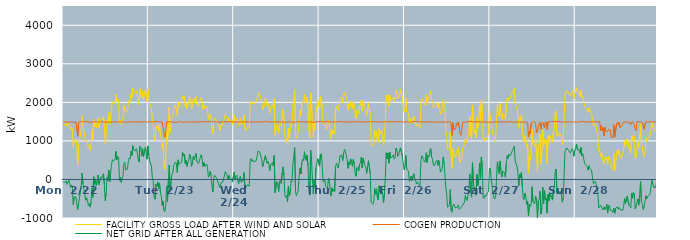
| Category | FACILITY GROSS LOAD AFTER WIND AND SOLAR | COGEN PRODUCTION | NET GRID AFTER ALL GENERATION |
|---|---|---|---|
|  Mon  2/22 | 1425 | 1504 | -79 |
|  Mon  2/22 | 1432 | 1490 | -58 |
|  Mon  2/22 | 1416 | 1486 | -70 |
|  Mon  2/22 | 1455 | 1494 | -39 |
|  Mon  2/22 | 1371 | 1497 | -126 |
|  Mon  2/22 | 1423 | 1491 | -68 |
|  Mon  2/22 | 1472 | 1481 | -9 |
|  Mon  2/22 | 1395 | 1493 | -98 |
|  Mon  2/22 | 1285 | 1495 | -210 |
|  Mon  2/22 | 1351 | 1493 | -142 |
|  Mon  2/22 | 1308 | 1497 | -189 |
|  Mon  2/22 | 839 | 1493 | -654 |
|  Mon  2/22 | 1015 | 1475 | -460 |
|  Mon  2/22 | 1027 | 1500 | -473 |
|  Mon  2/22 | 1042 | 1495 | -453 |
|  Mon  2/22 | 847 | 1485 | -638 |
|  Mon  2/22 | 346 | 1122 | -776 |
|  Mon  2/22 | 831 | 1474 | -643 |
|  Mon  2/22 | 1028 | 1493 | -465 |
|  Mon  2/22 | 1154 | 1503 | -349 |
|  Mon  2/22 | 1323 | 1505 | -182 |
|  Mon  2/22 | 1661 | 1495 | 166 |
|  Mon  2/22 | 1390 | 1502 | -112 |
|  Mon  2/22 | 1245 | 1497 | -252 |
|  Mon  2/22 | 1099 | 1480 | -381 |
|  Mon  2/22 | 953 | 1494 | -541 |
|  Mon  2/22 | 1009 | 1487 | -478 |
|  Mon  2/22 | 965 | 1502 | -537 |
|  Mon  2/22 | 834 | 1507 | -673 |
|  Mon  2/22 | 866 | 1492 | -626 |
|  Mon  2/22 | 742 | 1460 | -718 |
|  Mon  2/22 | 898 | 1493 | -595 |
|  Mon  2/22 | 1268 | 1491 | -223 |
|  Mon  2/22 | 1029 | 1493 | -464 |
|  Mon  2/22 | 1568 | 1497 | 71 |
|  Mon  2/22 | 1360 | 1495 | -135 |
|  Mon  2/22 | 1515 | 1501 | 14 |
|  Mon  2/22 | 1344 | 1502 | -158 |
|  Mon  2/22 | 1446 | 1501 | -55 |
|  Mon  2/22 | 1597 | 1482 | 115 |
|  Mon  2/22 | 1349 | 1483 | -134 |
|  Mon  2/22 | 1457 | 1497 | -40 |
|  Mon  2/22 | 1559 | 1490 | 69 |
|  Mon  2/22 | 1535 | 1506 | 29 |
|  Mon  2/22 | 1553 | 1500 | 53 |
|  Mon  2/22 | 1634 | 1487 | 147 |
|  Mon  2/22 | 1366 | 1494 | -128 |
|  Mon  2/22 | 931 | 1487 | -556 |
|  Mon  2/22 | 1148 | 1496 | -348 |
|  Mon  2/22 | 1531 | 1483 | 48 |
|  Mon  2/22 | 1461 | 1490 | -29 |
|  Mon  2/22 | 1730 | 1487 | 243 |
|  Mon  2/22 | 1424 | 1489 | -65 |
|  Mon  2/22 | 1641 | 1489 | 152 |
|  Mon  2/22 | 1857 | 1495 | 362 |
|  Mon  2/22 | 2005 | 1491 | 514 |
|  Mon  2/22 | 1972 | 1495 | 477 |
|  Mon  2/22 | 1964 | 1495 | 469 |
|  Mon  2/22 | 2003 | 1487 | 516 |
|  Mon  2/22 | 2212 | 1484 | 728 |
|  Mon  2/22 | 2017 | 1502 | 515 |
|  Mon  2/22 | 2092 | 1496 | 596 |
|  Mon  2/22 | 2055 | 1507 | 548 |
|  Mon  2/22 | 1480 | 1501 | -21 |
|  Mon  2/22 | 1539 | 1487 | 52 |
|  Mon  2/22 | 1419 | 1491 | -72 |
|  Mon  2/22 | 1528 | 1500 | 28 |
|  Mon  2/22 | 1597 | 1490 | 107 |
|  Mon  2/22 | 1923 | 1506 | 417 |
|  Mon  2/22 | 1934 | 1491 | 443 |
|  Mon  2/22 | 1736 | 1491 | 245 |
|  Mon  2/22 | 1759 | 1490 | 269 |
|  Mon  2/22 | 1772 | 1501 | 271 |
|  Mon  2/22 | 1963 | 1491 | 472 |
|  Mon  2/22 | 2054 | 1494 | 560 |
|  Mon  2/22 | 2024 | 1493 | 531 |
|  Mon  2/22 | 2221 | 1487 | 734 |
|  Mon  2/22 | 2120 | 1496 | 624 |
|  Mon  2/22 | 2366 | 1494 | 872 |
|  Mon  2/22 | 2260 | 1497 | 763 |
|  Mon  2/22 | 2269 | 1487 | 782 |
|  Mon  2/22 | 2230 | 1484 | 746 |
|  Mon  2/22 | 2305 | 1501 | 804 |
|  Mon  2/22 | 2205 | 1495 | 710 |
|  Mon  2/22 | 2030 | 1492 | 538 |
|  Mon  2/22 | 1938 | 1487 | 451 |
|  Mon  2/22 | 2352 | 1487 | 865 |
|  Mon  2/22 | 2330 | 1498 | 832 |
|  Mon  2/22 | 2109 | 1500 | 609 |
|  Mon  2/22 | 2291 | 1492 | 799 |
|  Mon  2/22 | 2080 | 1489 | 591 |
|  Mon  2/22 | 2207 | 1499 | 708 |
|  Mon  2/22 | 2321 | 1487 | 834 |
|  Mon  2/22 | 2219 | 1493 | 726 |
|  Mon  2/22 | 2004 | 1478 | 526 |
|  Mon  2/22 | 2356 | 1488 | 868 |
|  Tue  2/23 | 2133 | 1497 | 636 |
|  Tue  2/23 | 1982 | 1503 | 479 |
|  Tue  2/23 | 1987 | 1502 | 485 |
|  Tue  2/23 | 1826 | 1488 | 338 |
|  Tue  2/23 | 1543 | 1501 | 42 |
|  Tue  2/23 | 1434 | 1492 | -58 |
|  Tue  2/23 | 1033 | 1487 | -454 |
|  Tue  2/23 | 985 | 1500 | -515 |
|  Tue  2/23 | 1376 | 1495 | -119 |
|  Tue  2/23 | 1312 | 1496 | -184 |
|  Tue  2/23 | 1434 | 1495 | -61 |
|  Tue  2/23 | 1270 | 1503 | -233 |
|  Tue  2/23 | 1399 | 1490 | -91 |
|  Tue  2/23 | 1166 | 1491 | -325 |
|  Tue  2/23 | 1063 | 1494 | -431 |
|  Tue  2/23 | 817 | 1491 | -674 |
|  Tue  2/23 | 943 | 1504 | -561 |
|  Tue  2/23 | 422 | 1217 | -795 |
|  Tue  2/23 | 256 | 1093 | -837 |
|  Tue  2/23 | 538 | 1239 | -701 |
|  Tue  2/23 | 1311 | 1496 | -185 |
|  Tue  2/23 | 919 | 1493 | -574 |
|  Tue  2/23 | 1468 | 1496 | -28 |
|  Tue  2/23 | 1874 | 1501 | 373 |
|  Tue  2/23 | 1221 | 1501 | -280 |
|  Tue  2/23 | 1407 | 1492 | -85 |
|  Tue  2/23 | 1617 | 1488 | 129 |
|  Tue  2/23 | 1668 | 1489 | 179 |
|  Tue  2/23 | 1844 | 1487 | 357 |
|  Tue  2/23 | 1843 | 1484 | 359 |
|  Tue  2/23 | 1931 | 1481 | 450 |
|  Tue  2/23 | 1910 | 1493 | 417 |
|  Tue  2/23 | 1668 | 1489 | 179 |
|  Tue  2/23 | 2002 | 1494 | 508 |
|  Tue  2/23 | 1882 | 1488 | 394 |
|  Tue  2/23 | 1902 | 1480 | 422 |
|  Tue  2/23 | 1949 | 1505 | 444 |
|  Tue  2/23 | 1952 | 1499 | 453 |
|  Tue  2/23 | 2175 | 1476 | 699 |
|  Tue  2/23 | 2101 | 1493 | 608 |
|  Tue  2/23 | 2156 | 1496 | 660 |
|  Tue  2/23 | 1894 | 1482 | 412 |
|  Tue  2/23 | 1982 | 1488 | 494 |
|  Tue  2/23 | 1836 | 1494 | 342 |
|  Tue  2/23 | 1943 | 1484 | 459 |
|  Tue  2/23 | 1982 | 1488 | 494 |
|  Tue  2/23 | 2142 | 1495 | 647 |
|  Tue  2/23 | 2091 | 1505 | 586 |
|  Tue  2/23 | 1828 | 1486 | 342 |
|  Tue  2/23 | 1917 | 1488 | 429 |
|  Tue  2/23 | 2092 | 1495 | 597 |
|  Tue  2/23 | 1994 | 1481 | 513 |
|  Tue  2/23 | 1987 | 1489 | 498 |
|  Tue  2/23 | 2155 | 1485 | 670 |
|  Tue  2/23 | 1953 | 1490 | 463 |
|  Tue  2/23 | 1978 | 1499 | 479 |
|  Tue  2/23 | 1901 | 1490 | 411 |
|  Tue  2/23 | 1970 | 1485 | 485 |
|  Tue  2/23 | 2085 | 1503 | 582 |
|  Tue  2/23 | 2135 | 1493 | 642 |
|  Tue  2/23 | 2025 | 1499 | 526 |
|  Tue  2/23 | 1813 | 1474 | 339 |
|  Tue  2/23 | 1920 | 1484 | 436 |
|  Tue  2/23 | 1841 | 1498 | 343 |
|  Tue  2/23 | 1826 | 1501 | 325 |
|  Tue  2/23 | 1902 | 1504 | 398 |
|  Tue  2/23 | 1814 | 1495 | 319 |
|  Tue  2/23 | 1553 | 1495 | 58 |
|  Tue  2/23 | 1596 | 1503 | 93 |
|  Tue  2/23 | 1691 | 1485 | 206 |
|  Tue  2/23 | 1605 | 1496 | 109 |
|  Tue  2/23 | 1321 | 1494 | -173 |
|  Tue  2/23 | 1182 | 1504 | -322 |
|  Tue  2/23 | 1519 | 1495 | 24 |
|  Tue  2/23 | 1593 | 1486 | 107 |
|  Tue  2/23 | 1615 | 1497 | 118 |
|  Tue  2/23 | 1547 | 1500 | 47 |
|  Tue  2/23 | 1483 | 1490 | -7 |
|  Tue  2/23 | 1388 | 1482 | -94 |
|  Tue  2/23 | 1415 | 1500 | -85 |
|  Tue  2/23 | 1274 | 1488 | -214 |
|  Tue  2/23 | 1409 | 1496 | -87 |
|  Tue  2/23 | 1394 | 1497 | -103 |
|  Tue  2/23 | 1410 | 1485 | -75 |
|  Tue  2/23 | 1416 | 1496 | -80 |
|  Tue  2/23 | 1582 | 1494 | 88 |
|  Tue  2/23 | 1695 | 1491 | 204 |
|  Tue  2/23 | 1640 | 1482 | 158 |
|  Tue  2/23 | 1600 | 1497 | 103 |
|  Tue  2/23 | 1516 | 1503 | 13 |
|  Tue  2/23 | 1598 | 1497 | 101 |
|  Tue  2/23 | 1500 | 1491 | 9 |
|  Tue  2/23 | 1531 | 1503 | 28 |
|  Tue  2/23 | 1504 | 1495 | 9 |
|  Tue  2/23 | 1431 | 1497 | -66 |
|  Tue  2/23 | 1432 | 1492 | -60 |
|  Wed  2/24 | 1678 | 1491 | 187 |
|  Wed  2/24 | 1484 | 1492 | -8 |
|  Wed  2/24 | 1563 | 1490 | 73 |
|  Wed  2/24 | 1600 | 1485 | 115 |
|  Wed  2/24 | 1461 | 1486 | -25 |
|  Wed  2/24 | 1399 | 1505 | -106 |
|  Wed  2/24 | 1526 | 1492 | 34 |
|  Wed  2/24 | 1581 | 1494 | 87 |
|  Wed  2/24 | 1419 | 1492 | -73 |
|  Wed  2/24 | 1500 | 1501 | -1 |
|  Wed  2/24 | 1452 | 1494 | -42 |
|  Wed  2/24 | 1669 | 1490 | 179 |
|  Wed  2/24 | 1344 | 1489 | -145 |
|  Wed  2/24 | 1267 | 1491 | -224 |
|  Wed  2/24 | 1323 | 1499 | -176 |
|  Wed  2/24 | 1351 | 1488 | -137 |
|  Wed  2/24 | 1360 | 1486 | -126 |
|  Wed  2/24 | 1330 | 1503 | -173 |
|  Wed  2/24 | 2003 | 1496 | 507 |
|  Wed  2/24 | 2034 | 1494 | 540 |
|  Wed  2/24 | 1954 | 1485 | 469 |
|  Wed  2/24 | 1997 | 1489 | 508 |
|  Wed  2/24 | 1954 | 1496 | 458 |
|  Wed  2/24 | 1941 | 1485 | 456 |
|  Wed  2/24 | 1967 | 1493 | 474 |
|  Wed  2/24 | 1986 | 1482 | 504 |
|  Wed  2/24 | 2125 | 1494 | 631 |
|  Wed  2/24 | 2221 | 1483 | 738 |
|  Wed  2/24 | 2252 | 1497 | 755 |
|  Wed  2/24 | 2195 | 1489 | 706 |
|  Wed  2/24 | 2080 | 1489 | 591 |
|  Wed  2/24 | 2011 | 1485 | 526 |
|  Wed  2/24 | 1813 | 1481 | 332 |
|  Wed  2/24 | 1918 | 1507 | 411 |
|  Wed  2/24 | 1886 | 1500 | 386 |
|  Wed  2/24 | 2124 | 1504 | 620 |
|  Wed  2/24 | 1996 | 1491 | 505 |
|  Wed  2/24 | 1901 | 1489 | 412 |
|  Wed  2/24 | 1974 | 1499 | 475 |
|  Wed  2/24 | 1912 | 1497 | 415 |
|  Wed  2/24 | 1722 | 1489 | 233 |
|  Wed  2/24 | 1862 | 1487 | 375 |
|  Wed  2/24 | 1839 | 1487 | 352 |
|  Wed  2/24 | 1934 | 1493 | 441 |
|  Wed  2/24 | 1845 | 1494 | 351 |
|  Wed  2/24 | 2110 | 1490 | 620 |
|  Wed  2/24 | 1140 | 1484 | -344 |
|  Wed  2/24 | 1137 | 1487 | -350 |
|  Wed  2/24 | 1427 | 1487 | -60 |
|  Wed  2/24 | 1381 | 1501 | -120 |
|  Wed  2/24 | 1183 | 1494 | -311 |
|  Wed  2/24 | 1435 | 1493 | -58 |
|  Wed  2/24 | 1495 | 1489 | 6 |
|  Wed  2/24 | 1380 | 1488 | -108 |
|  Wed  2/24 | 1668 | 1504 | 164 |
|  Wed  2/24 | 1816 | 1490 | 326 |
|  Wed  2/24 | 1610 | 1496 | 114 |
|  Wed  2/24 | 1065 | 1482 | -417 |
|  Wed  2/24 | 1012 | 1480 | -468 |
|  Wed  2/24 | 1069 | 1484 | -415 |
|  Wed  2/24 | 920 | 1494 | -574 |
|  Wed  2/24 | 1331 | 1505 | -174 |
|  Wed  2/24 | 1068 | 1490 | -422 |
|  Wed  2/24 | 1088 | 1479 | -391 |
|  Wed  2/24 | 1467 | 1493 | -26 |
|  Wed  2/24 | 1441 | 1496 | -55 |
|  Wed  2/24 | 1898 | 1493 | 405 |
|  Wed  2/24 | 2065 | 1486 | 579 |
|  Wed  2/24 | 2313 | 1488 | 825 |
|  Wed  2/24 | 1176 | 1489 | -313 |
|  Wed  2/24 | 1071 | 1491 | -420 |
|  Wed  2/24 | 1131 | 1498 | -367 |
|  Wed  2/24 | 1212 | 1501 | -289 |
|  Wed  2/24 | 1559 | 1489 | 70 |
|  Wed  2/24 | 1788 | 1491 | 297 |
|  Wed  2/24 | 1648 | 1507 | 141 |
|  Wed  2/24 | 1950 | 1499 | 451 |
|  Wed  2/24 | 2010 | 1488 | 522 |
|  Wed  2/24 | 1978 | 1493 | 485 |
|  Wed  2/24 | 2213 | 1493 | 720 |
|  Wed  2/24 | 2016 | 1485 | 531 |
|  Wed  2/24 | 1984 | 1492 | 492 |
|  Wed  2/24 | 2136 | 1498 | 638 |
|  Wed  2/24 | 1841 | 1492 | 349 |
|  Wed  2/24 | 1287 | 1506 | -219 |
|  Wed  2/24 | 1085 | 1493 | -408 |
|  Wed  2/24 | 2260 | 1501 | 759 |
|  Wed  2/24 | 1967 | 1493 | 474 |
|  Wed  2/24 | 1512 | 1504 | 8 |
|  Wed  2/24 | 1098 | 1477 | -379 |
|  Wed  2/24 | 1493 | 1492 | 1 |
|  Wed  2/24 | 1286 | 1489 | -203 |
|  Wed  2/24 | 1791 | 1486 | 305 |
|  Wed  2/24 | 1790 | 1501 | 289 |
|  Wed  2/24 | 2044 | 1503 | 541 |
|  Wed  2/24 | 2054 | 1489 | 565 |
|  Thu  2/25 | 1841 | 1495 | 346 |
|  Thu  2/25 | 2151 | 1509 | 642 |
|  Thu  2/25 | 2164 | 1495 | 669 |
|  Thu  2/25 | 1857 | 1496 | 361 |
|  Thu  2/25 | 1434 | 1498 | -64 |
|  Thu  2/25 | 1424 | 1485 | -61 |
|  Thu  2/25 | 1466 | 1487 | -21 |
|  Thu  2/25 | 1315 | 1510 | -195 |
|  Thu  2/25 | 1282 | 1490 | -208 |
|  Thu  2/25 | 1264 | 1502 | -238 |
|  Thu  2/25 | 1529 | 1496 | 33 |
|  Thu  2/25 | 1444 | 1491 | -47 |
|  Thu  2/25 | 1218 | 1501 | -283 |
|  Thu  2/25 | 1066 | 1494 | -428 |
|  Thu  2/25 | 1290 | 1504 | -214 |
|  Thu  2/25 | 1185 | 1495 | -310 |
|  Thu  2/25 | 1246 | 1495 | -249 |
|  Thu  2/25 | 1177 | 1491 | -314 |
|  Thu  2/25 | 1826 | 1498 | 328 |
|  Thu  2/25 | 1908 | 1487 | 421 |
|  Thu  2/25 | 1828 | 1486 | 342 |
|  Thu  2/25 | 1786 | 1493 | 293 |
|  Thu  2/25 | 1938 | 1501 | 437 |
|  Thu  2/25 | 2119 | 1506 | 613 |
|  Thu  2/25 | 2123 | 1496 | 627 |
|  Thu  2/25 | 2126 | 1499 | 627 |
|  Thu  2/25 | 1980 | 1491 | 489 |
|  Thu  2/25 | 2153 | 1493 | 660 |
|  Thu  2/25 | 2266 | 1485 | 781 |
|  Thu  2/25 | 2223 | 1487 | 736 |
|  Thu  2/25 | 2211 | 1489 | 722 |
|  Thu  2/25 | 2030 | 1501 | 529 |
|  Thu  2/25 | 1793 | 1506 | 287 |
|  Thu  2/25 | 1944 | 1489 | 455 |
|  Thu  2/25 | 1875 | 1497 | 378 |
|  Thu  2/25 | 2023 | 1490 | 533 |
|  Thu  2/25 | 1936 | 1493 | 443 |
|  Thu  2/25 | 1829 | 1487 | 342 |
|  Thu  2/25 | 2010 | 1491 | 519 |
|  Thu  2/25 | 1909 | 1502 | 407 |
|  Thu  2/25 | 1658 | 1495 | 163 |
|  Thu  2/25 | 1576 | 1494 | 82 |
|  Thu  2/25 | 1799 | 1487 | 312 |
|  Thu  2/25 | 1778 | 1494 | 284 |
|  Thu  2/25 | 1704 | 1485 | 219 |
|  Thu  2/25 | 1891 | 1495 | 396 |
|  Thu  2/25 | 1937 | 1506 | 431 |
|  Thu  2/25 | 2059 | 1482 | 577 |
|  Thu  2/25 | 1778 | 1475 | 303 |
|  Thu  2/25 | 2057 | 1505 | 552 |
|  Thu  2/25 | 1932 | 1493 | 439 |
|  Thu  2/25 | 1845 | 1485 | 360 |
|  Thu  2/25 | 1804 | 1483 | 321 |
|  Thu  2/25 | 1655 | 1496 | 159 |
|  Thu  2/25 | 1818 | 1491 | 327 |
|  Thu  2/25 | 1988 | 1502 | 486 |
|  Thu  2/25 | 1980 | 1498 | 482 |
|  Thu  2/25 | 1653 | 1495 | 158 |
|  Thu  2/25 | 911 | 1500 | -589 |
|  Thu  2/25 | 923 | 1490 | -567 |
|  Thu  2/25 | 862 | 1508 | -646 |
|  Thu  2/25 | 928 | 1507 | -579 |
|  Thu  2/25 | 1263 | 1499 | -236 |
|  Thu  2/25 | 1121 | 1502 | -381 |
|  Thu  2/25 | 1251 | 1492 | -241 |
|  Thu  2/25 | 1032 | 1490 | -458 |
|  Thu  2/25 | 965 | 1498 | -533 |
|  Thu  2/25 | 1327 | 1492 | -165 |
|  Thu  2/25 | 1179 | 1504 | -325 |
|  Thu  2/25 | 1244 | 1501 | -257 |
|  Thu  2/25 | 1272 | 1494 | -222 |
|  Thu  2/25 | 1060 | 1479 | -419 |
|  Thu  2/25 | 891 | 1491 | -600 |
|  Thu  2/25 | 1177 | 1504 | -327 |
|  Thu  2/25 | 1554 | 1507 | 47 |
|  Thu  2/25 | 2179 | 1487 | 692 |
|  Thu  2/25 | 2028 | 1499 | 529 |
|  Thu  2/25 | 2189 | 1501 | 688 |
|  Thu  2/25 | 1920 | 1500 | 420 |
|  Thu  2/25 | 2198 | 1490 | 708 |
|  Thu  2/25 | 2047 | 1489 | 558 |
|  Thu  2/25 | 2062 | 1506 | 556 |
|  Thu  2/25 | 2088 | 1496 | 592 |
|  Thu  2/25 | 2136 | 1492 | 644 |
|  Thu  2/25 | 2012 | 1488 | 524 |
|  Thu  2/25 | 2069 | 1498 | 571 |
|  Thu  2/25 | 2308 | 1492 | 816 |
|  Thu  2/25 | 2250 | 1489 | 761 |
|  Thu  2/25 | 2090 | 1495 | 595 |
|  Thu  2/25 | 2134 | 1497 | 637 |
|  Thu  2/25 | 2231 | 1495 | 736 |
|  Thu  2/25 | 2328 | 1508 | 820 |
|  Thu  2/25 | 2323 | 1509 | 814 |
|  Thu  2/25 | 2115 | 1489 | 626 |
|  Thu  2/25 | 2129 | 1494 | 635 |
|  Thu  2/25 | 1744 | 1490 | 254 |
|  Fri  2/26 | 1811 | 1491 | 320 |
|  Fri  2/26 | 2119 | 1495 | 624 |
|  Fri  2/26 | 1765 | 1485 | 280 |
|  Fri  2/26 | 1782 | 1496 | 286 |
|  Fri  2/26 | 1721 | 1507 | 214 |
|  Fri  2/26 | 1433 | 1480 | -47 |
|  Fri  2/26 | 1497 | 1488 | 9 |
|  Fri  2/26 | 1578 | 1488 | 90 |
|  Fri  2/26 | 1469 | 1498 | -29 |
|  Fri  2/26 | 1495 | 1505 | -10 |
|  Fri  2/26 | 1632 | 1486 | 146 |
|  Fri  2/26 | 1524 | 1507 | 17 |
|  Fri  2/26 | 1462 | 1497 | -35 |
|  Fri  2/26 | 1382 | 1500 | -118 |
|  Fri  2/26 | 1448 | 1504 | -56 |
|  Fri  2/26 | 1389 | 1505 | -116 |
|  Fri  2/26 | 1388 | 1499 | -111 |
|  Fri  2/26 | 1336 | 1492 | -156 |
|  Fri  2/26 | 1967 | 1487 | 480 |
|  Fri  2/26 | 2115 | 1498 | 617 |
|  Fri  2/26 | 2088 | 1492 | 596 |
|  Fri  2/26 | 2006 | 1484 | 522 |
|  Fri  2/26 | 1933 | 1487 | 446 |
|  Fri  2/26 | 1968 | 1490 | 478 |
|  Fri  2/26 | 2183 | 1491 | 692 |
|  Fri  2/26 | 1935 | 1495 | 440 |
|  Fri  2/26 | 2136 | 1505 | 631 |
|  Fri  2/26 | 2080 | 1497 | 583 |
|  Fri  2/26 | 2246 | 1493 | 753 |
|  Fri  2/26 | 2295 | 1490 | 805 |
|  Fri  2/26 | 2073 | 1491 | 582 |
|  Fri  2/26 | 2019 | 1486 | 533 |
|  Fri  2/26 | 1860 | 1475 | 385 |
|  Fri  2/26 | 1842 | 1492 | 350 |
|  Fri  2/26 | 1920 | 1499 | 421 |
|  Fri  2/26 | 1946 | 1486 | 460 |
|  Fri  2/26 | 1993 | 1491 | 502 |
|  Fri  2/26 | 1857 | 1491 | 366 |
|  Fri  2/26 | 1981 | 1488 | 493 |
|  Fri  2/26 | 1862 | 1479 | 383 |
|  Fri  2/26 | 1685 | 1497 | 188 |
|  Fri  2/26 | 1719 | 1496 | 223 |
|  Fri  2/26 | 1777 | 1492 | 285 |
|  Fri  2/26 | 2067 | 1484 | 583 |
|  Fri  2/26 | 1922 | 1497 | 425 |
|  Fri  2/26 | 1887 | 1486 | 401 |
|  Fri  2/26 | 1273 | 1476 | -203 |
|  Fri  2/26 | 1096 | 1489 | -393 |
|  Fri  2/26 | 767 | 1490 | -723 |
|  Fri  2/26 | 772 | 1496 | -724 |
|  Fri  2/26 | 827 | 1480 | -653 |
|  Fri  2/26 | 1237 | 1500 | -263 |
|  Fri  2/26 | 616 | 1417 | -801 |
|  Fri  2/26 | 287 | 1141 | -854 |
|  Fri  2/26 | 806 | 1473 | -667 |
|  Fri  2/26 | 655 | 1290 | -635 |
|  Fri  2/26 | 674 | 1292 | -618 |
|  Fri  2/26 | 566 | 1308 | -742 |
|  Fri  2/26 | 713 | 1451 | -738 |
|  Fri  2/26 | 691 | 1406 | -715 |
|  Fri  2/26 | 831 | 1495 | -664 |
|  Fri  2/26 | 587 | 1360 | -773 |
|  Fri  2/26 | 435 | 1196 | -761 |
|  Fri  2/26 | 416 | 1143 | -727 |
|  Fri  2/26 | 577 | 1305 | -728 |
|  Fri  2/26 | 825 | 1490 | -665 |
|  Fri  2/26 | 860 | 1500 | -640 |
|  Fri  2/26 | 895 | 1482 | -587 |
|  Fri  2/26 | 1079 | 1494 | -415 |
|  Fri  2/26 | 979 | 1498 | -519 |
|  Fri  2/26 | 952 | 1498 | -546 |
|  Fri  2/26 | 957 | 1485 | -528 |
|  Fri  2/26 | 1267 | 1516 | -249 |
|  Fri  2/26 | 1638 | 1500 | 138 |
|  Fri  2/26 | 1163 | 1506 | -343 |
|  Fri  2/26 | 1038 | 1497 | -459 |
|  Fri  2/26 | 1933 | 1497 | 436 |
|  Fri  2/26 | 1417 | 1497 | -80 |
|  Fri  2/26 | 1212 | 1489 | -277 |
|  Fri  2/26 | 1281 | 1493 | -212 |
|  Fri  2/26 | 1087 | 1494 | -407 |
|  Fri  2/26 | 1619 | 1489 | 130 |
|  Fri  2/26 | 1340 | 1500 | -160 |
|  Fri  2/26 | 1475 | 1487 | -12 |
|  Fri  2/26 | 1925 | 1497 | 428 |
|  Fri  2/26 | 1515 | 1494 | 21 |
|  Fri  2/26 | 2070 | 1486 | 584 |
|  Fri  2/26 | 1798 | 1488 | 310 |
|  Fri  2/26 | 1032 | 1497 | -465 |
|  Fri  2/26 | 994 | 1486 | -492 |
|  Fri  2/26 | 1077 | 1488 | -411 |
|  Fri  2/26 | 1057 | 1494 | -437 |
|  Fri  2/26 | 1043 | 1486 | -443 |
|  Fri  2/26 | 1143 | 1484 | -341 |
|  Fri  2/26 | 1177 | 1490 | -313 |
|  Fri  2/26 | 1766 | 1499 | 267 |
|  Sat  2/27 | 1782 | 1484 | 298 |
|  Sat  2/27 | 1510 | 1488 | 22 |
|  Sat  2/27 | 1326 | 1480 | -154 |
|  Sat  2/27 | 1144 | 1494 | -350 |
|  Sat  2/27 | 1029 | 1496 | -467 |
|  Sat  2/27 | 988 | 1496 | -508 |
|  Sat  2/27 | 1039 | 1492 | -453 |
|  Sat  2/27 | 1514 | 1500 | 14 |
|  Sat  2/27 | 1949 | 1491 | 458 |
|  Sat  2/27 | 1766 | 1495 | 271 |
|  Sat  2/27 | 1638 | 1496 | 142 |
|  Sat  2/27 | 1971 | 1491 | 480 |
|  Sat  2/27 | 1717 | 1490 | 227 |
|  Sat  2/27 | 1557 | 1495 | 62 |
|  Sat  2/27 | 1709 | 1489 | 220 |
|  Sat  2/27 | 1718 | 1488 | 230 |
|  Sat  2/27 | 1657 | 1487 | 170 |
|  Sat  2/27 | 1559 | 1500 | 59 |
|  Sat  2/27 | 1898 | 1492 | 406 |
|  Sat  2/27 | 2107 | 1488 | 619 |
|  Sat  2/27 | 2041 | 1496 | 545 |
|  Sat  2/27 | 2135 | 1480 | 655 |
|  Sat  2/27 | 2104 | 1493 | 611 |
|  Sat  2/27 | 2137 | 1492 | 645 |
|  Sat  2/27 | 2132 | 1500 | 632 |
|  Sat  2/27 | 2262 | 1508 | 754 |
|  Sat  2/27 | 2300 | 1481 | 819 |
|  Sat  2/27 | 2357 | 1493 | 864 |
|  Sat  2/27 | 1971 | 1484 | 487 |
|  Sat  2/27 | 1993 | 1490 | 503 |
|  Sat  2/27 | 1831 | 1491 | 340 |
|  Sat  2/27 | 1698 | 1498 | 200 |
|  Sat  2/27 | 1322 | 1493 | -171 |
|  Sat  2/27 | 1610 | 1487 | 123 |
|  Sat  2/27 | 1534 | 1487 | 47 |
|  Sat  2/27 | 1677 | 1494 | 183 |
|  Sat  2/27 | 1302 | 1489 | -187 |
|  Sat  2/27 | 1017 | 1497 | -480 |
|  Sat  2/27 | 959 | 1482 | -523 |
|  Sat  2/27 | 1141 | 1496 | -355 |
|  Sat  2/27 | 1047 | 1492 | -445 |
|  Sat  2/27 | 854 | 1497 | -643 |
|  Sat  2/27 | 918 | 1479 | -561 |
|  Sat  2/27 | 162 | 1099 | -937 |
|  Sat  2/27 | 597 | 1247 | -650 |
|  Sat  2/27 | 498 | 1196 | -698 |
|  Sat  2/27 | 796 | 1453 | -657 |
|  Sat  2/27 | 1300 | 1489 | -189 |
|  Sat  2/27 | 913 | 1487 | -574 |
|  Sat  2/27 | 934 | 1500 | -566 |
|  Sat  2/27 | 857 | 1491 | -634 |
|  Sat  2/27 | 1030 | 1465 | -435 |
|  Sat  2/27 | 665 | 1208 | -543 |
|  Sat  2/27 | 210 | 1238 | -1028 |
|  Sat  2/27 | 813 | 1365 | -552 |
|  Sat  2/27 | 934 | 1444 | -510 |
|  Sat  2/27 | 1187 | 1492 | -305 |
|  Sat  2/27 | 406 | 1301 | -895 |
|  Sat  2/27 | 716 | 1453 | -737 |
|  Sat  2/27 | 1288 | 1484 | -196 |
|  Sat  2/27 | 863 | 1489 | -626 |
|  Sat  2/27 | 1052 | 1338 | -286 |
|  Sat  2/27 | 939 | 1471 | -532 |
|  Sat  2/27 | 1015 | 1497 | -482 |
|  Sat  2/27 | 414 | 1288 | -874 |
|  Sat  2/27 | 1114 | 1497 | -383 |
|  Sat  2/27 | 947 | 1504 | -557 |
|  Sat  2/27 | 1144 | 1495 | -351 |
|  Sat  2/27 | 1158 | 1495 | -337 |
|  Sat  2/27 | 1019 | 1501 | -482 |
|  Sat  2/27 | 962 | 1499 | -537 |
|  Sat  2/27 | 1231 | 1491 | -260 |
|  Sat  2/27 | 1283 | 1496 | -213 |
|  Sat  2/27 | 1715 | 1513 | 202 |
|  Sat  2/27 | 1772 | 1502 | 270 |
|  Sat  2/27 | 1119 | 1493 | -374 |
|  Sat  2/27 | 1149 | 1493 | -344 |
|  Sat  2/27 | 1211 | 1508 | -297 |
|  Sat  2/27 | 1117 | 1493 | -376 |
|  Sat  2/27 | 1183 | 1496 | -313 |
|  Sat  2/27 | 1094 | 1486 | -392 |
|  Sat  2/27 | 909 | 1498 | -589 |
|  Sat  2/27 | 1008 | 1495 | -487 |
|  Sat  2/27 | 1552 | 1490 | 62 |
|  Sat  2/27 | 2227 | 1494 | 733 |
|  Sat  2/27 | 2205 | 1489 | 716 |
|  Sat  2/27 | 2307 | 1487 | 820 |
|  Sat  2/27 | 2324 | 1491 | 833 |
|  Sat  2/27 | 2240 | 1491 | 749 |
|  Sat  2/27 | 2253 | 1495 | 758 |
|  Sat  2/27 | 2177 | 1488 | 689 |
|  Sat  2/27 | 2168 | 1492 | 676 |
|  Sat  2/27 | 2293 | 1495 | 798 |
|  Sat  2/27 | 2249 | 1494 | 755 |
|  Sat  2/27 | 2099 | 1497 | 602 |
|  Sat  2/27 | 2226 | 1491 | 735 |
|  Sun  2/28 | 2319 | 1494 | 825 |
|  Sun  2/28 | 2393 | 1475 | 918 |
|  Sun  2/28 | 2263 | 1491 | 772 |
|  Sun  2/28 | 2261 | 1500 | 761 |
|  Sun  2/28 | 2266 | 1492 | 774 |
|  Sun  2/28 | 2161 | 1483 | 678 |
|  Sun  2/28 | 2323 | 1496 | 827 |
|  Sun  2/28 | 2125 | 1511 | 614 |
|  Sun  2/28 | 2165 | 1498 | 667 |
|  Sun  2/28 | 2042 | 1502 | 540 |
|  Sun  2/28 | 1905 | 1477 | 428 |
|  Sun  2/28 | 1872 | 1490 | 382 |
|  Sun  2/28 | 1893 | 1499 | 394 |
|  Sun  2/28 | 1812 | 1487 | 325 |
|  Sun  2/28 | 1750 | 1508 | 242 |
|  Sun  2/28 | 1864 | 1507 | 357 |
|  Sun  2/28 | 1775 | 1485 | 290 |
|  Sun  2/28 | 1749 | 1486 | 263 |
|  Sun  2/28 | 1715 | 1496 | 219 |
|  Sun  2/28 | 1533 | 1490 | 43 |
|  Sun  2/28 | 1396 | 1505 | -109 |
|  Sun  2/28 | 1406 | 1504 | -98 |
|  Sun  2/28 | 1455 | 1505 | -50 |
|  Sun  2/28 | 1387 | 1496 | -109 |
|  Sun  2/28 | 1216 | 1490 | -274 |
|  Sun  2/28 | 1134 | 1485 | -351 |
|  Sun  2/28 | 740 | 1476 | -736 |
|  Sun  2/28 | 786 | 1502 | -716 |
|  Sun  2/28 | 601 | 1269 | -668 |
|  Sun  2/28 | 693 | 1412 | -719 |
|  Sun  2/28 | 547 | 1266 | -719 |
|  Sun  2/28 | 544 | 1337 | -793 |
|  Sun  2/28 | 419 | 1130 | -711 |
|  Sun  2/28 | 576 | 1359 | -783 |
|  Sun  2/28 | 539 | 1260 | -721 |
|  Sun  2/28 | 582 | 1229 | -647 |
|  Sun  2/28 | 397 | 1262 | -865 |
|  Sun  2/28 | 601 | 1296 | -695 |
|  Sun  2/28 | 597 | 1259 | -662 |
|  Sun  2/28 | 495 | 1290 | -795 |
|  Sun  2/28 | 304 | 1082 | -778 |
|  Sun  2/28 | 275 | 1082 | -807 |
|  Sun  2/28 | 238 | 1094 | -856 |
|  Sun  2/28 | 674 | 1420 | -746 |
|  Sun  2/28 | 220 | 1096 | -876 |
|  Sun  2/28 | 347 | 1097 | -750 |
|  Sun  2/28 | 672 | 1431 | -759 |
|  Sun  2/28 | 782 | 1486 | -704 |
|  Sun  2/28 | 638 | 1415 | -777 |
|  Sun  2/28 | 754 | 1481 | -727 |
|  Sun  2/28 | 594 | 1338 | -744 |
|  Sun  2/28 | 533 | 1331 | -798 |
|  Sun  2/28 | 586 | 1393 | -807 |
|  Sun  2/28 | 583 | 1379 | -796 |
|  Sun  2/28 | 778 | 1486 | -708 |
|  Sun  2/28 | 1000 | 1491 | -491 |
|  Sun  2/28 | 861 | 1488 | -627 |
|  Sun  2/28 | 861 | 1495 | -634 |
|  Sun  2/28 | 1061 | 1493 | -432 |
|  Sun  2/28 | 1062 | 1499 | -437 |
|  Sun  2/28 | 818 | 1491 | -673 |
|  Sun  2/28 | 810 | 1495 | -685 |
|  Sun  2/28 | 683 | 1419 | -736 |
|  Sun  2/28 | 1130 | 1490 | -360 |
|  Sun  2/28 | 1009 | 1494 | -485 |
|  Sun  2/28 | 1149 | 1489 | -340 |
|  Sun  2/28 | 1110 | 1486 | -376 |
|  Sun  2/28 | 543 | 1308 | -765 |
|  Sun  2/28 | 577 | 1267 | -690 |
|  Sun  2/28 | 833 | 1505 | -672 |
|  Sun  2/28 | 974 | 1481 | -507 |
|  Sun  2/28 | 828 | 1495 | -667 |
|  Sun  2/28 | 1104 | 1504 | -400 |
|  Sun  2/28 | 1442 | 1497 | -55 |
|  Sun  2/28 | 903 | 1492 | -589 |
|  Sun  2/28 | 844 | 1482 | -638 |
|  Sun  2/28 | 632 | 1411 | -779 |
|  Sun  2/28 | 591 | 1301 | -710 |
|  Sun  2/28 | 716 | 1448 | -732 |
|  Sun  2/28 | 1078 | 1499 | -421 |
|  Sun  2/28 | 986 | 1489 | -503 |
|  Sun  2/28 | 1041 | 1479 | -438 |
|  Sun  2/28 | 1083 | 1496 | -413 |
|  Sun  2/28 | 1087 | 1495 | -408 |
|  Sun  2/28 | 1156 | 1487 | -331 |
|  Sun  2/28 | 1362 | 1496 | -134 |
|  Sun  2/28 | 1472 | 1495 | -23 |
|  Sun  2/28 | 1360 | 1500 | -140 |
|  Sun  2/28 | 1276 | 1495 | -219 |
|  Sun  2/28 | 1300 | 1487 | -187 |
|  Sun  2/28 | 1273 | 1491 | -218 |
|  Sun  2/28 | 1459 | 1497 | -38 |